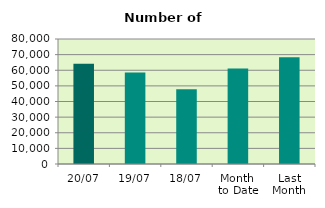
| Category | Series 0 |
|---|---|
| 20/07 | 64236 |
| 19/07 | 58498 |
| 18/07 | 47896 |
| Month 
to Date | 61052.286 |
| Last
Month | 68392.182 |